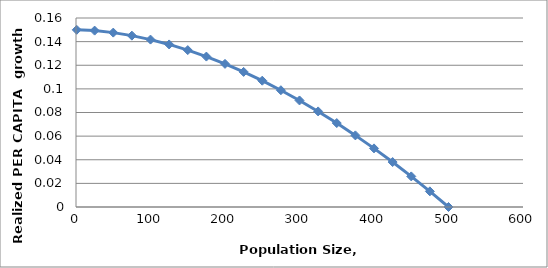
| Category | per capita growth rate= r(1-(N/K)exp(theta)) |
|---|---|
| 1.0 | 0.15 |
| 25.0 | 0.149 |
| 50.0 | 0.148 |
| 75.0 | 0.145 |
| 100.0 | 0.142 |
| 125.0 | 0.138 |
| 150.0 | 0.133 |
| 175.0 | 0.127 |
| 200.0 | 0.121 |
| 225.0 | 0.114 |
| 250.0 | 0.107 |
| 275.0 | 0.099 |
| 300.0 | 0.09 |
| 325.0 | 0.081 |
| 350.0 | 0.071 |
| 375.0 | 0.061 |
| 400.0 | 0.05 |
| 425.0 | 0.038 |
| 450.0 | 0.026 |
| 475.0 | 0.013 |
| 500.0 | 0 |